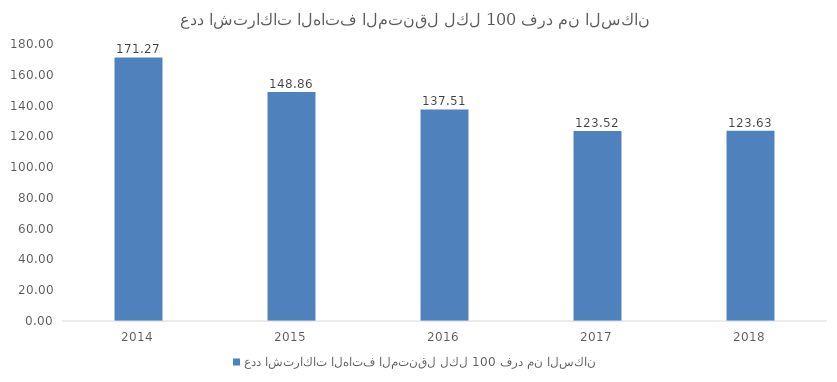
| Category | عدد اشتراكات الهاتف المتنقل لكل 100 فرد من السكان |
|---|---|
| 2014 | 171.269 |
| 2015 | 148.858 |
| 2016 | 137.514 |
| 2017 | 123.524 |
| 2018 | 123.63 |